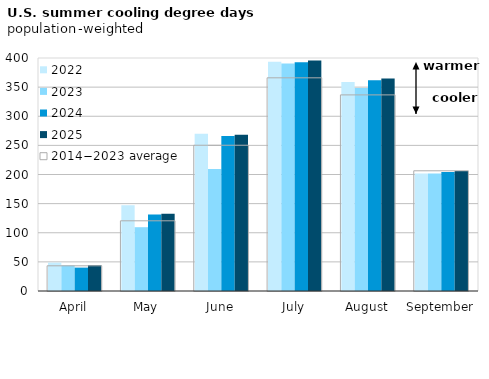
| Category | 2022 | 2023 | 2024 | 2025 |
|---|---|---|---|---|
| April | 48.756 | 43.905 | 40.163 | 44.433 |
| May | 147.283 | 109.518 | 131.445 | 132.623 |
| June | 269.801 | 209.345 | 266.129 | 268.245 |
| July | 393.735 | 390.423 | 392.884 | 395.809 |
| August | 358.799 | 348.354 | 361.863 | 364.609 |
| September | 201.858 | 201.924 | 204.164 | 205.855 |